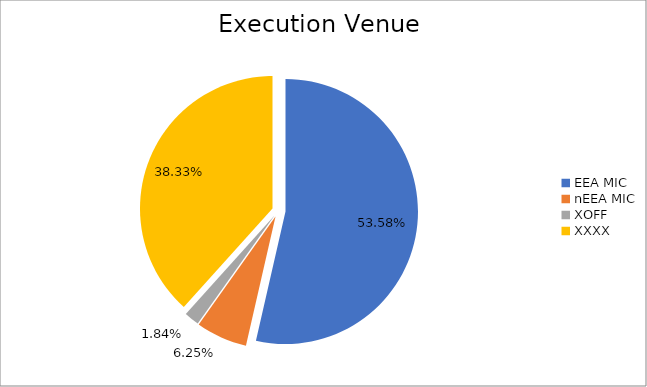
| Category | Series 0 |
|---|---|
| EEA MIC | 6831770.063 |
| nEEA MIC | 797209.949 |
| XOFF | 234093.186 |
| XXXX | 4886809.422 |